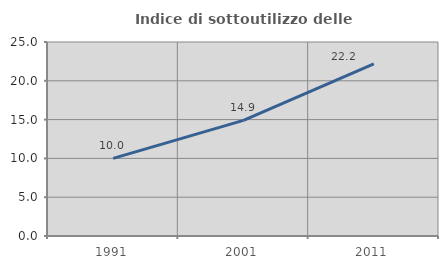
| Category | Indice di sottoutilizzo delle abitazioni  |
|---|---|
| 1991.0 | 10.005 |
| 2001.0 | 14.907 |
| 2011.0 | 22.181 |